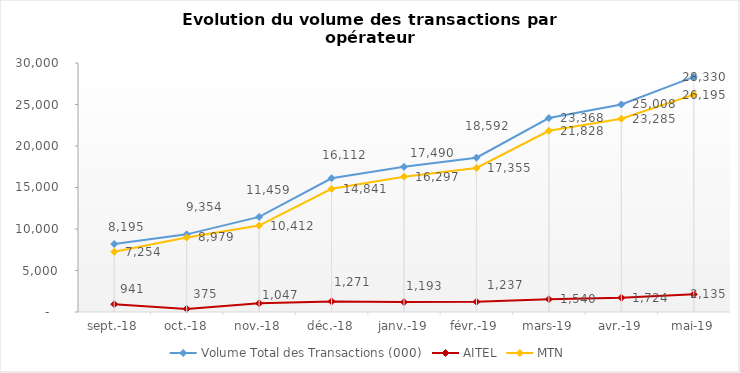
| Category | Volume Total des Transactions (000) | AITEL | MTN |
|---|---|---|---|
| 2018-09-01 | 8195.064 | 940.996 | 7254.068 |
| 2018-10-01 | 9353.633 | 374.614 | 8979.019 |
| 2018-11-01 | 11458.757 | 1046.981 | 10411.776 |
| 2018-12-01 | 16111.971 | 1271.092 | 14840.879 |
| 2019-01-01 | 17490.117 | 1192.882 | 16297.235 |
| 2019-02-01 | 18591.8 | 1236.897 | 17354.903 |
| 2019-03-01 | 23367.813 | 1540.25 | 21827.563 |
| 2019-04-01 | 25008.33 | 1723.759 | 23284.571 |
| 2019-05-01 | 28329.829 | 2134.873 | 26194.956 |